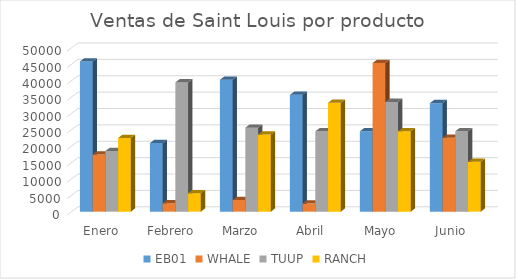
| Category | EB01 | WHALE | TUUP | RANCH |
|---|---|---|---|---|
| Enero | 45861 | 17443 | 18515 | 22491 |
| Febrero | 20939 | 2571 | 39459 | 5613 |
| Marzo | 40254 | 3562 | 25625 | 23524 |
| Abril | 35652 | 2453 | 24512 | 33256 |
| Mayo | 24532 | 45365 | 33512 | 24523 |
| Junio | 33125 | 22541 | 24552 | 15232 |